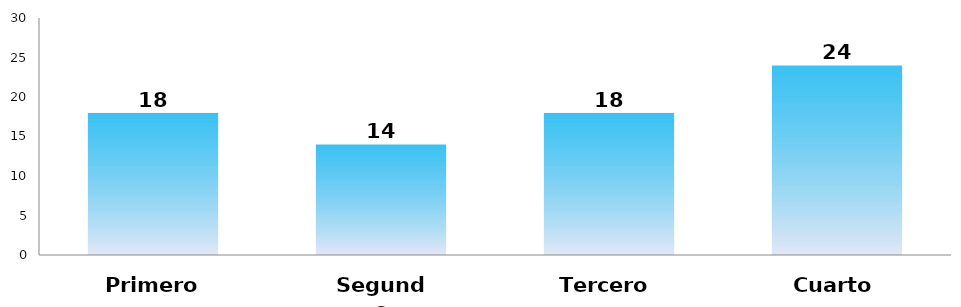
| Category | Series 0 |
|---|---|
| 0 | 18 |
| 1 | 14 |
| 2 | 18 |
| 3 | 24 |